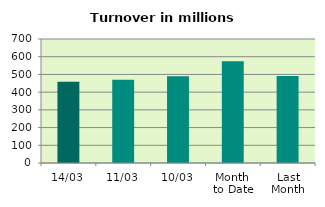
| Category | Series 0 |
|---|---|
| 14/03 | 458.837 |
| 11/03 | 469.711 |
| 10/03 | 489.78 |
| Month 
to Date | 574.795 |
| Last
Month | 490.433 |